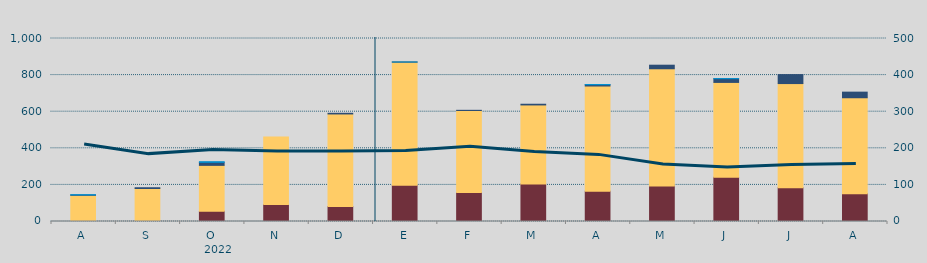
| Category | Carbón | Ciclo Combinado | Cogeneración | Consumo Bombeo | Eólica | Hidráulica | Otras Renovables | Solar fotovoltaica | Solar térmica | Turbinación bombeo | Nuclear |
|---|---|---|---|---|---|---|---|---|---|---|---|
| A | 0 | 142890.1 | 241.5 | 1836 | 0 | 1759 | 0 | 0 | 0 | 0 | 0 |
| S | 2508 | 177724.1 | 0 | 4233 | 0 | 0 | 52.5 | 0 | 0 | 0 | 0 |
| O | 55771 | 250950.8 | 0 | 16354.2 | 0 | 3609 | 27 | 0 | 0 | 0 | 0 |
| N | 92910 | 369242.3 | 0 | 0 | 0 | 0 | 0 | 0 | 0 | 0 | 0 |
| D | 82210 | 505508.6 | 0 | 3568.7 | 0 | 0 | 0 | 0 | 0 | 0 | 0 |
| E | 198667 | 672278.9 | 0 | 600 | 0 | 167.2 | 0 | 0 | 0 | 0 | 0 |
| F | 158446.8 | 448230.6 | 0 | 876 | 0 | 0 | 0 | 0 | 0 | 0 | 0 |
| M | 205470 | 431456.4 | 0 | 3844 | 0 | 0 | 0 | 0 | 0 | 0 | 0 |
| A | 165579 | 574881.6 | 0 | 7190 | 0 | 954 | 0 | 0 | 0 | 0 | 0 |
| M | 194640 | 639265.9 | 701 | 19503.3 | 0 | 0 | 0 | 0 | 0 | 0 | 0 |
| J | 241510 | 518484.5 | 0 | 20561.8 | 0 | 350.1 | 0 | 0 | 0 | 0 | 0 |
| J | 184698 | 569012.5 | 0 | 49075.9 | 0 | 0 | 0 | 0 | 0 | 0 | 0 |
| A | 151988 | 524255.8 | 0 | 30631.6 | 0 | 0 | 0 | 0 | 0 | 0 | 0 |